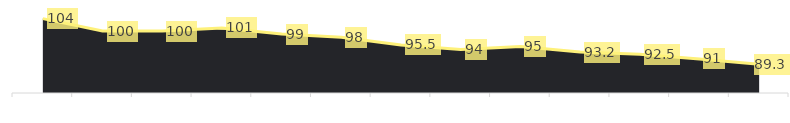
| Category | Summe von Ist |
|---|---|
| 0 | 104 |
| 1 | 100 |
| 2 | 100 |
| 3 | 101 |
| 4 | 99 |
| 5 | 98 |
| 6 | 95.5 |
| 7 | 94 |
| 8 | 95 |
| 9 | 93.2 |
| 10 | 92.5 |
| 11 | 91 |
| 12 | 89.3 |